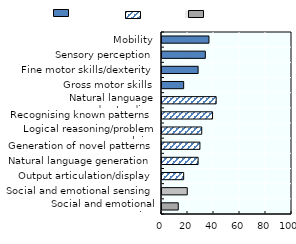
| Category | Mean rating |
|---|---|
| Social and emotional reasoning | 12.5 |
| Social and emotional sensing | 19.444 |
| Output articulation/display | 16.667 |
| Natural language generation | 27.778 |
| Generation of novel patterns | 29.167 |
| Logical reasoning/problem solving | 30.556 |
| Recognising known patterns | 38.889 |
| Natural language understanding | 41.667 |
| Gross motor skills | 16.667 |
| Fine motor skills/dexterity | 27.778 |
| Sensory perception | 33.333 |
| Mobility | 36.111 |